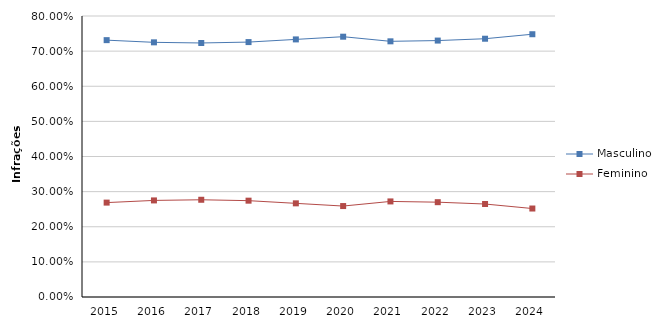
| Category | Masculino | Feminino |
|---|---|---|
| 2015 | 0.731 | 0.269 |
| 2016 | 0.725 | 0.275 |
| 2017 | 0.723 | 0.277 |
| 2018 | 0.726 | 0.274 |
| 2019 | 0.733 | 0.267 |
| 2020 | 0.741 | 0.259 |
| 2021 | 0.728 | 0.272 |
| 2022 | 0.73 | 0.27 |
| 2023 | 0.735 | 0.265 |
| 2024 | 0.748 | 0.252 |